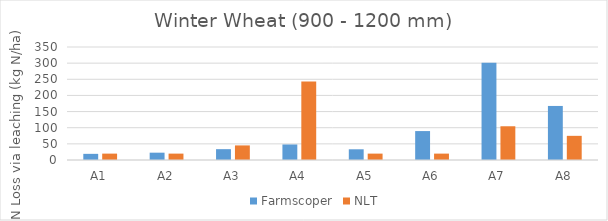
| Category | Farmscoper | NLT |
|---|---|---|
| A1 | 19.054 | 19.77 |
| A2 | 22.68 | 19.77 |
| A3 | 33.562 | 45.18 |
| A4 | 48.07 | 242.92 |
| A5 | 33.164 | 19.77 |
| A6 | 89.6 | 19.77 |
| A7 | 301.258 | 104.5 |
| A8 | 167.41 | 74.84 |